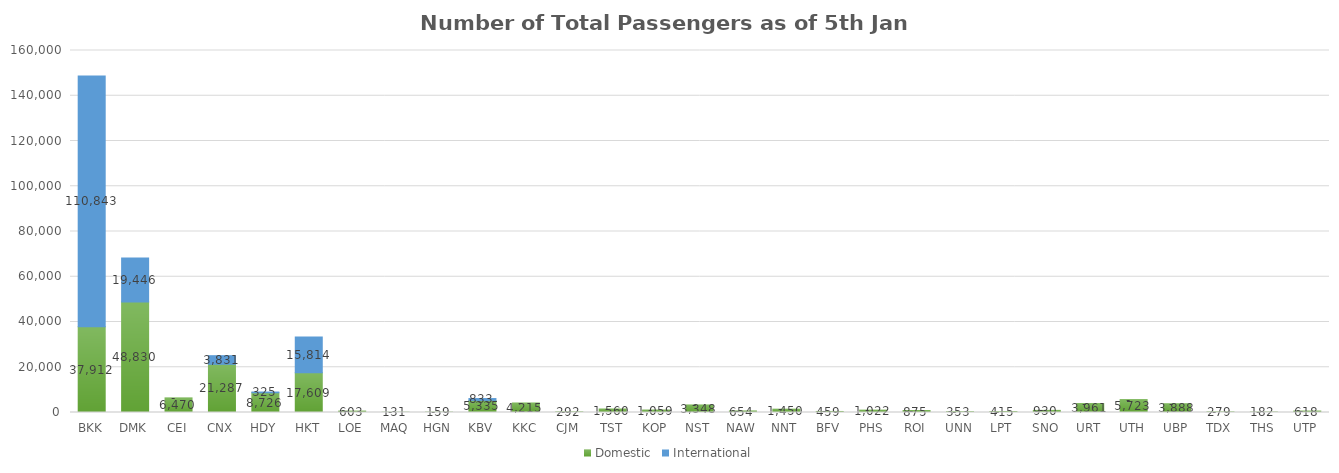
| Category | Domestic | International |
|---|---|---|
| BKK | 37912 | 110843 |
| DMK | 48830 | 19446 |
| CEI | 6470 | 0 |
| CNX | 21287 | 3831 |
| HDY | 8726 | 325 |
| HKT | 17609 | 15814 |
| LOE | 603 | 0 |
| MAQ | 131 | 0 |
| HGN | 159 | 0 |
| KBV | 5335 | 833 |
| KKC | 4215 | 0 |
| CJM | 292 | 0 |
| TST | 1560 | 0 |
| KOP | 1059 | 0 |
| NST | 3348 | 0 |
| NAW | 654 | 0 |
| NNT | 1450 | 0 |
| BFV | 459 | 0 |
| PHS | 1022 | 0 |
| ROI | 875 | 0 |
| UNN | 353 | 0 |
| LPT | 415 | 0 |
| SNO | 930 | 0 |
| URT | 3961 | 0 |
| UTH | 5723 | 0 |
| UBP | 3888 | 0 |
| TDX | 279 | 0 |
| THS | 182 | 0 |
| UTP | 618 | 0 |